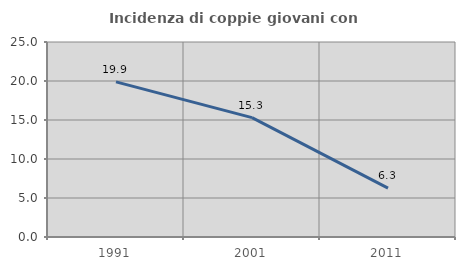
| Category | Incidenza di coppie giovani con figli |
|---|---|
| 1991.0 | 19.887 |
| 2001.0 | 15.309 |
| 2011.0 | 6.259 |